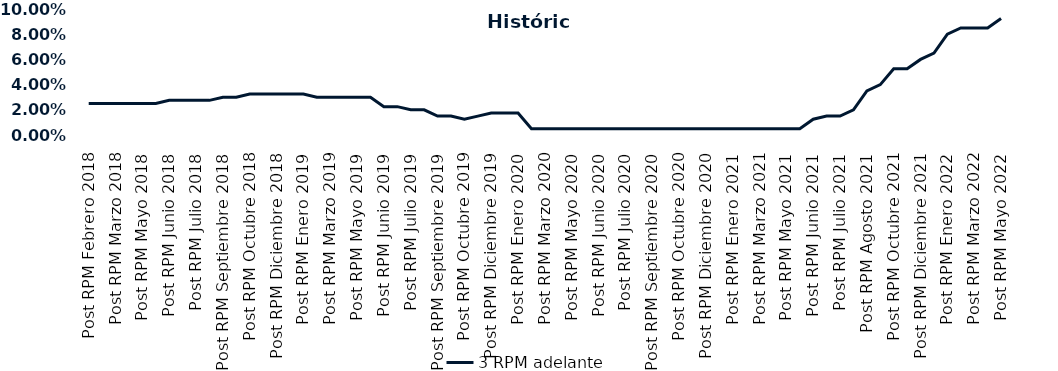
| Category | 3 RPM adelante |
|---|---|
| Post RPM Febrero 2018 | 0.025 |
| Pre RPM Marzo 2018 | 0.025 |
| Post RPM Marzo 2018 | 0.025 |
| Pre RPM Mayo 2018 | 0.025 |
| Post RPM Mayo 2018 | 0.025 |
| Pre RPM Junio 2018 | 0.025 |
| Post RPM Junio 2018 | 0.028 |
| Pre RPM Julio 2018 | 0.028 |
| Post RPM Julio 2018 | 0.028 |
| Pre RPM Septiembre 2018 | 0.028 |
| Post RPM Septiembre 2018 | 0.03 |
| Pre RPM Octubre 2018 | 0.03 |
| Post RPM Octubre 2018 | 0.032 |
| Pre RPM Diciembre 2018 | 0.032 |
| Post RPM Diciembre 2018 | 0.032 |
| Pre RPM Enero 2019 | 0.032 |
| Post RPM Enero 2019 | 0.032 |
| Pre RPM Marzo 2019 | 0.03 |
| Post RPM Marzo 2019 | 0.03 |
| Pre RPM Mayo 2019 | 0.03 |
| Post RPM Mayo 2019 | 0.03 |
| Pre RPM Junio 2019 | 0.03 |
| Post RPM Junio 2019 | 0.022 |
| Pre RPM Julio 2019 | 0.022 |
| Post RPM Julio 2019 | 0.02 |
| Pre RPM Septiembre 2019 | 0.02 |
| Post RPM Septiembre 2019 | 0.015 |
| Pre RPM Octubre 2019 | 0.015 |
| Post RPM Octubre 2019 | 0.012 |
| Pre RPM Diciembre 2019 | 0.015 |
| Post RPM Diciembre 2019 | 0.018 |
| Pre RPM Enero 2020 | 0.018 |
| Post RPM Enero 2020 | 0.018 |
| Pre RPM Marzo 2020 | 0.005 |
| Post RPM Marzo 2020 | 0.005 |
| Pre RPM Mayo 2020 | 0.005 |
| Post RPM Mayo 2020 | 0.005 |
| Pre RPM Junio 2020 | 0.005 |
| Post RPM Junio 2020 | 0.005 |
| Pre RPM Julio 2020 | 0.005 |
| Post RPM Julio 2020 | 0.005 |
| Pre RPM Septiembre 2020 | 0.005 |
| Post RPM Septiembre 2020 | 0.005 |
| Pre RPM Octubre 2020 | 0.005 |
| Post RPM Octubre 2020 | 0.005 |
| Pre RPM Diciembre 2020 | 0.005 |
| Post RPM Diciembre 2020 | 0.005 |
| Pre RPM Enero 2021 | 0.005 |
| Post RPM Enero 2021 | 0.005 |
| Pre RPM Marzo 2021 | 0.005 |
| Post RPM Marzo 2021 | 0.005 |
| Pre RPM Mayo 2021 | 0.005 |
| Post RPM Mayo 2021 | 0.005 |
| Pre RPM Junio 2021 | 0.005 |
| Post RPM Junio 2021 | 0.012 |
| Pre RPM Julio 2021 | 0.015 |
| Post RPM Julio 2021 | 0.015 |
| Pre RPM Agosto 2021 | 0.02 |
| Post RPM Agosto 2021 | 0.035 |
| Pre RPM Octubre 2021 | 0.04 |
| Post RPM Octubre 2021 | 0.052 |
| Pre RPM Diciembre 2021 | 0.052 |
| Post RPM Diciembre 2021 | 0.06 |
| Pre RPM Enero 2022 | 0.065 |
| Post RPM Enero 2022 | 0.08 |
| Pre RPM Marzo 2022 | 0.085 |
| Post RPM Marzo 2022 | 0.085 |
| Pre RPM Mayo 2022 | 0.085 |
| Post RPM Mayo 2022 | 0.092 |